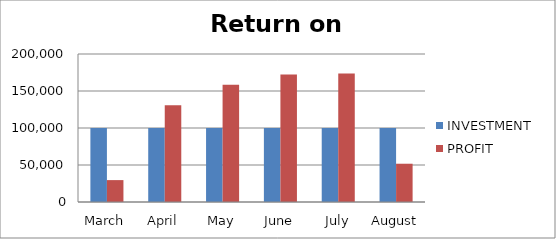
| Category | INVESTMENT  | PROFIT |
|---|---|---|
| March | 100000 | 29587 |
| April | 100000 | 130907 |
| May | 100000 | 158415 |
| June | 100000 | 172357 |
| July | 100000 | 173565 |
| August | 100000 | 51720 |